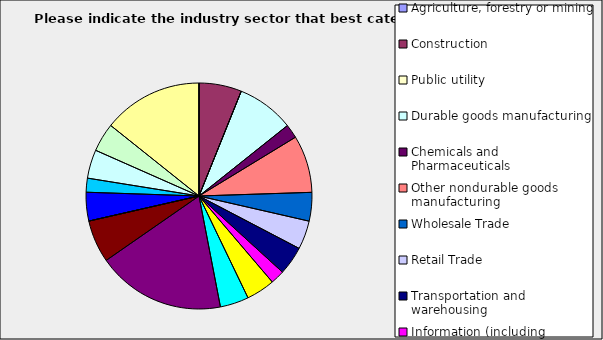
| Category | Series 0 |
|---|---|
| Agriculture, forestry or mining | 0 |
| Construction | 0.061 |
| Public utility | 0 |
| Durable goods manufacturing | 0.082 |
| Chemicals and Pharmaceuticals | 0.02 |
| Other nondurable goods manufacturing | 0.082 |
| Wholesale Trade | 0.041 |
| Retail Trade | 0.041 |
| Transportation and warehousing | 0.041 |
| Information (including broadcasting and telecommunication) | 0.02 |
| Finance and Insurance | 0.041 |
| Real Estate | 0.041 |
| Professional, scientific and technical services | 0.184 |
| Consulting | 0.061 |
| Administrative and office services (including waste management) | 0 |
| Education | 0.041 |
| Health Care and social services | 0.02 |
| Arts, entertainment and recreation | 0.041 |
| Accommodation and food services | 0.041 |
| Other | 0.143 |